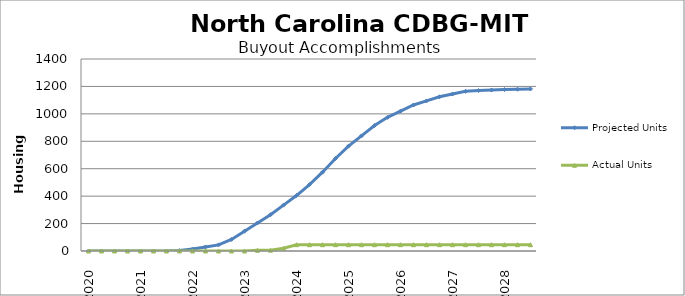
| Category | Projected Units | Actual Units |
|---|---|---|
| 01/2020 | 0 | 0 |
| 04/2020 | 0 | 0 |
| 07/2020 | 0 | 0 |
| 10/2020 | 0 | 0 |
| 01/2021 | 0 | 0 |
| 04/2021 | 0 | 0 |
| 07/2021 | 0 | 0 |
| 10/2021 | 3 | 0 |
| 01/2022 | 14.5 | 0 |
| 04/2022 | 29.5 | 0 |
| 07/2022 | 44.5 | 0 |
| 10/2022 | 84.5 | 0 |
| 01/2023 | 144.5 | 0 |
| 04/2023 | 204.5 | 5 |
| 07/2023 | 264.5 | 6 |
| 10/2023 | 334.5 | 20 |
| 01/2024 | 404.5 | 46 |
| 04/2024 | 484.5 | 46 |
| 07/2024 | 574.5 | 46 |
| 10/2024 | 674.5 | 46 |
| 01/2025 | 764.5 | 46 |
| 04/2025 | 839.5 | 46 |
| 07/2025 | 914.5 | 46 |
| 10/2025 | 974.5 | 46 |
| 01/2026 | 1019.5 | 46 |
| 04/2026 | 1064.5 | 46 |
| 07/2026 | 1094.5 | 46 |
| 10/2026 | 1124.5 | 46 |
| 01/2027 | 1144.5 | 46 |
| 04/2027 | 1164.5 | 46 |
| 07/2027 | 1169.5 | 46 |
| 10/2027 | 1173.5 | 46 |
| 01/2028 | 1177.5 | 46 |
| 04/2028 | 1179.5 | 46 |
| 07/2028 | 1181.5 | 46 |